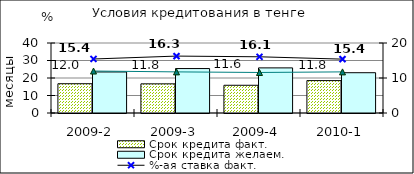
| Category | Срок кредита факт.  | Срок кредита желаем. |
|---|---|---|
| 2009-2 | 16.73 | 23.45 |
| 2009-3 | 16.66 | 25.4 |
| 2009-4 | 15.84 | 25.78 |
| 2010-1 | 18.51 | 23.02 |